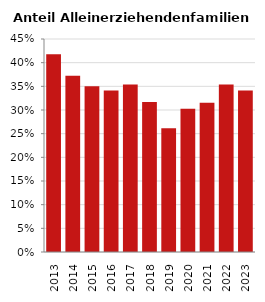
| Category | Anteil Alleinerziehende an Familien |
|---|---|
| 2013.0 | 0.418 |
| 2014.0 | 0.372 |
| 2015.0 | 0.35 |
| 2016.0 | 0.341 |
| 2017.0 | 0.354 |
| 2018.0 | 0.317 |
| 2019.0 | 0.261 |
| 2020.0 | 0.303 |
| 2021.0 | 0.315 |
| 2022.0 | 0.354 |
| 2023.0 | 0.341 |